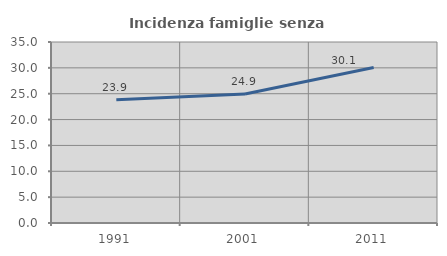
| Category | Incidenza famiglie senza nuclei |
|---|---|
| 1991.0 | 23.855 |
| 2001.0 | 24.947 |
| 2011.0 | 30.084 |